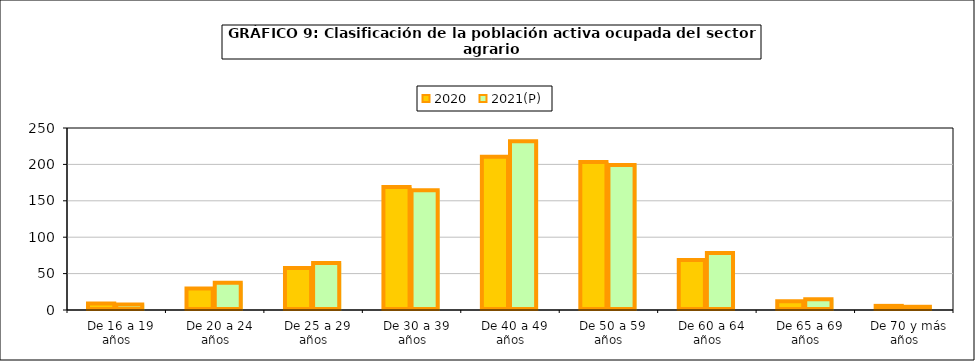
| Category | 2020 | 2021(P) |
|---|---|---|
|   De 16 a 19 años | 8.95 | 7.65 |
|   De 20 a 24 años | 29.7 | 37.575 |
|   De 25 a 29 años | 57.675 | 64.575 |
|   De 30 a 39 años | 169.1 | 164.35 |
|   De 40 a 49 años | 210.575 | 231.925 |
|   De 50 a 59 años | 203.15 | 199.025 |
|   De 60 a 64 años | 68.55 | 78.45 |
|   De 65 a 69 años | 11.925 | 14.725 |
|   De 70 y más años | 5.675 | 4.425 |